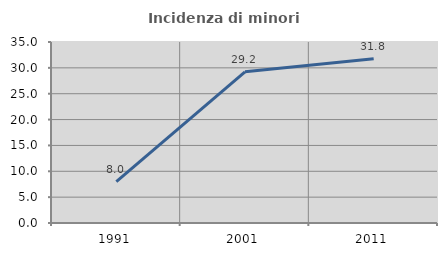
| Category | Incidenza di minori stranieri |
|---|---|
| 1991.0 | 8 |
| 2001.0 | 29.234 |
| 2011.0 | 31.776 |